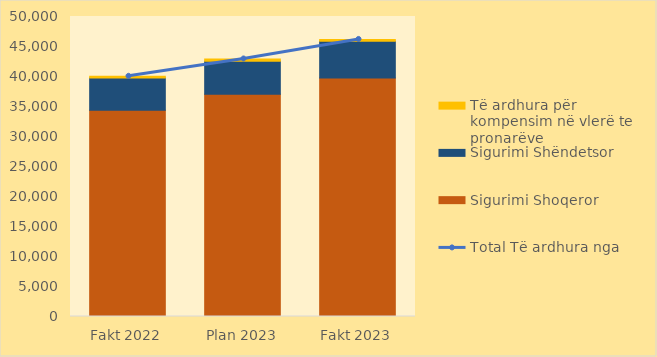
| Category | Sigurimi Shoqeror | Sigurimi Shëndetsor | Të ardhura për kompensim në vlerë te pronarëve |
|---|---|---|---|
| Fakt 2022 | 34392.98 | 5351.68 | 286.89 |
| Plan 2023 | 37058.881 | 5479.218 | 381.89 |
| Fakt 2023 | 39764.32 | 6091.1 | 320.68 |